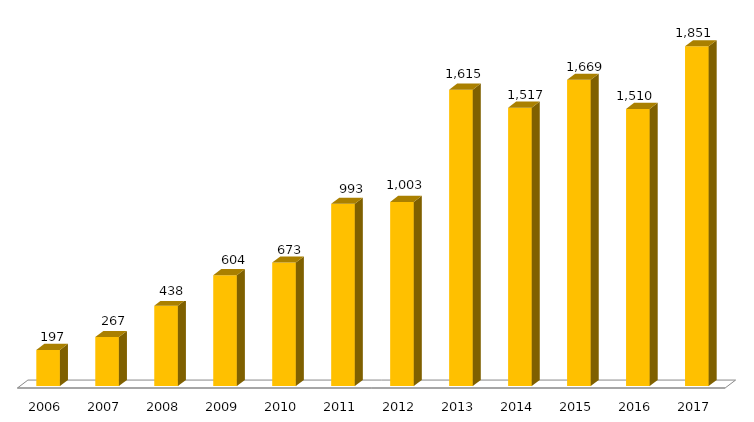
| Category | Pós - Gradução UFGD |
|---|---|
| 2006.0 | 197 |
| 2007.0 | 267 |
| 2008.0 | 438 |
| 2009.0 | 604 |
| 2010.0 | 673 |
| 2011.0 | 993 |
| 2012.0 | 1003 |
| 2013.0 | 1615 |
| 2014.0 | 1517 |
| 2015.0 | 1669 |
| 2016.0 | 1510 |
| 2017.0 | 1851 |